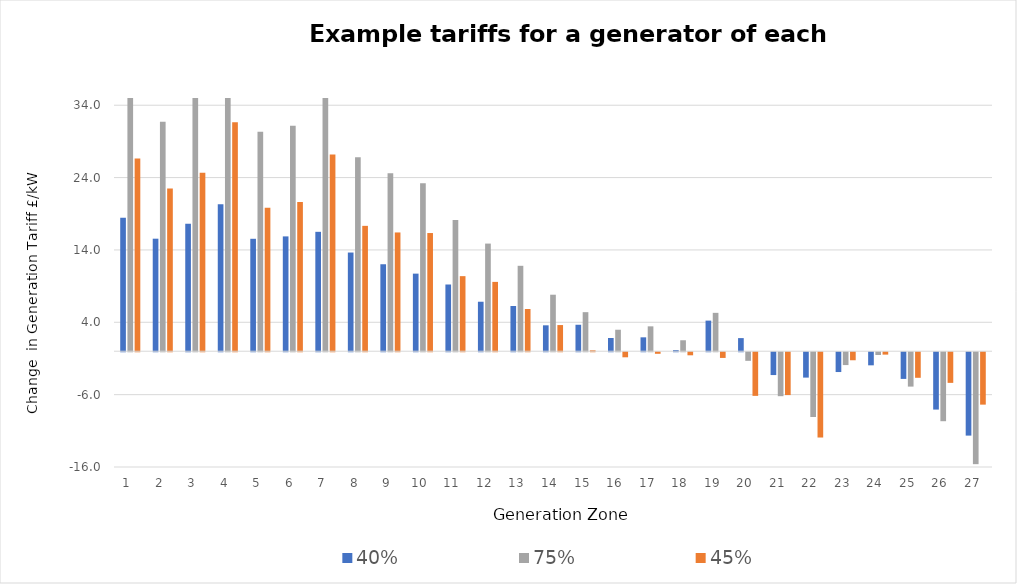
| Category | 40% | 75% | 45% |
|---|---|---|---|
| 1.0 | 18.466 | 37.843 | 26.644 |
| 2.0 | 15.555 | 31.706 | 22.496 |
| 3.0 | 17.62 | 35.656 | 24.676 |
| 4.0 | 20.308 | 42.518 | 31.633 |
| 5.0 | 15.541 | 30.328 | 19.829 |
| 6.0 | 15.872 | 31.171 | 20.618 |
| 7.0 | 16.505 | 35.588 | 27.195 |
| 8.0 | 13.642 | 26.806 | 17.329 |
| 9.0 | 12.022 | 24.585 | 16.416 |
| 10.0 | 10.725 | 23.233 | 16.337 |
| 11.0 | 9.223 | 18.155 | 10.378 |
| 12.0 | 6.842 | 14.879 | 9.584 |
| 13.0 | 6.249 | 11.809 | 5.836 |
| 14.0 | 3.582 | 7.811 | 3.618 |
| 15.0 | 3.659 | 5.4 | 0.134 |
| 16.0 | 1.83 | 2.972 | -0.699 |
| 17.0 | 1.922 | 3.44 | -0.216 |
| 18.0 | 0.16 | 1.517 | -0.423 |
| 19.0 | 4.232 | 5.305 | -0.788 |
| 20.0 | 1.814 | -1.19 | -6.031 |
| 21.0 | -3.155 | -6.074 | -5.921 |
| 22.0 | -3.508 | -8.953 | -11.787 |
| 23.0 | -2.737 | -1.774 | -1.108 |
| 24.0 | -1.809 | -0.38 | -0.33 |
| 25.0 | -3.687 | -4.749 | -3.533 |
| 26.0 | -7.925 | -9.532 | -4.234 |
| 27.0 | -11.523 | -15.469 | -7.242 |